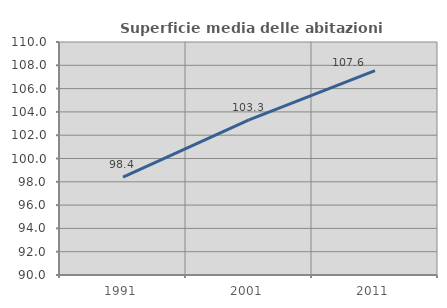
| Category | Superficie media delle abitazioni occupate |
|---|---|
| 1991.0 | 98.404 |
| 2001.0 | 103.319 |
| 2011.0 | 107.551 |